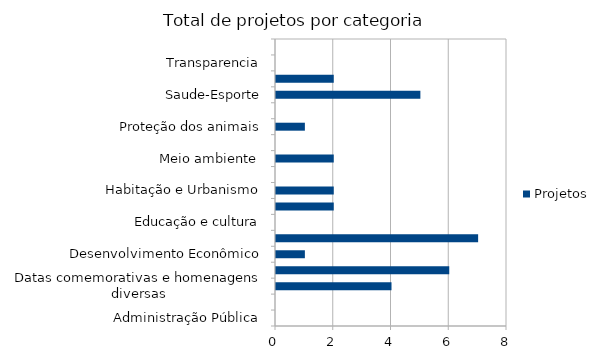
| Category | Projetos |
|---|---|
| Administração Pública | 0 |
| Combate à corrupção  | 0 |
| Datas comemorativas e homenagens diversas | 4 |
| Denominação de logradouro | 6 |
| Desenvolvimento Econômico | 1 |
| Desenvolvimento Social  | 7 |
| Educação e cultura | 0 |
| Frente parlamentar | 2 |
| Habitação e Urbanismo | 2 |
| Lei Orgânica do Município | 0 |
| Meio ambiente  | 2 |
| Mobilidade | 0 |
| Proteção dos animais | 1 |
| Regimento Interno da CMSP | 0 |
| Saude-Esporte | 5 |
| Segurança Pública | 2 |
| Transparencia | 0 |
| Tributação | 0 |